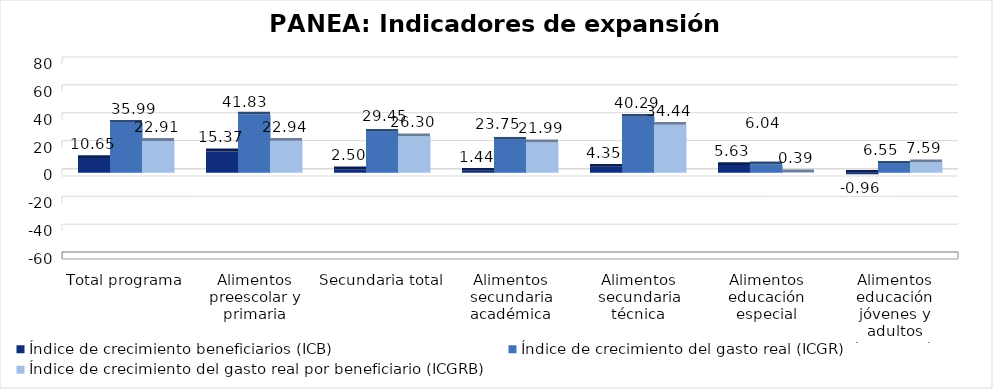
| Category | Índice de crecimiento beneficiarios (ICB)  | Índice de crecimiento del gasto real (ICGR)  | Índice de crecimiento del gasto real por beneficiario (ICGRB)  |
|---|---|---|---|
| Total programa | 10.648 | 35.994 | 22.907 |
| Alimentos preescolar y primaria | 15.371 | 41.833 | 22.937 |
| Secundaria total | 2.496 | 29.45 | 26.298 |
| Alimentos secundaria académica | 1.439 | 23.746 | 21.99 |
| Alimentos secundaria técnica | 4.345 | 40.286 | 34.444 |
| Alimentos educación especial | 5.626 | 6.039 | 0.391 |
| Alimentos educación jóvenes y adultos (nocturna)  | -0.962 | 6.552 | 7.586 |